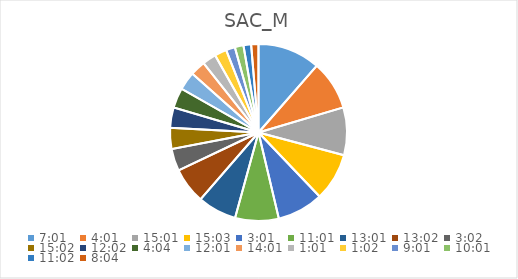
| Category | Series 0 |
|---|---|
| 0.2923611111111111 | 11.593 |
| 0.1673611111111111 | 9.151 |
| 0.6256944444444444 | 8.862 |
| 0.6270833333333333 | 8.862 |
| 0.12569444444444444 | 8.575 |
| 0.4590277777777778 | 8.076 |
| 0.5423611111111112 | 7.231 |
| 0.5430555555555555 | 6.675 |
| 0.12638888888888888 | 4.111 |
| 0.6263888888888889 | 3.914 |
| 0.5013888888888889 | 3.783 |
| 0.16944444444444443 | 3.718 |
| 0.5006944444444444 | 3.392 |
| 0.5840277777777778 | 2.811 |
| 0.042361111111111106 | 2.555 |
| 0.04305555555555556 | 2.236 |
| 0.3756944444444445 | 1.668 |
| 0.4173611111111111 | 1.605 |
| 0.4597222222222222 | 1.417 |
| 0.3361111111111111 | 1.355 |